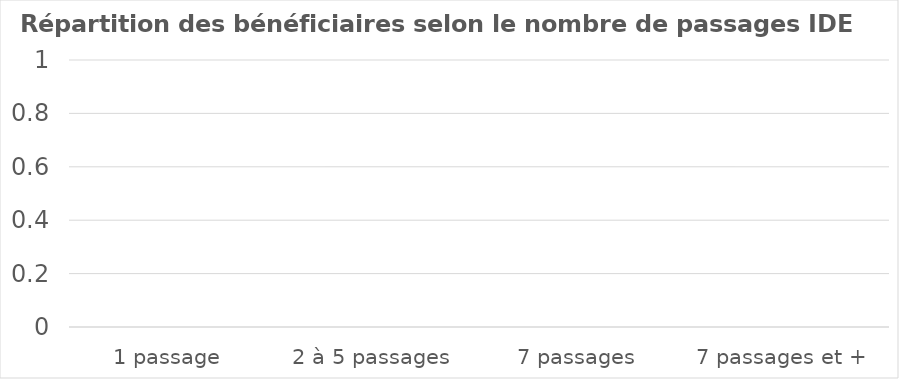
| Category | Series 0 |
|---|---|
| 1 passage | 0 |
| 2 à 5 passages | 0 |
| 7 passages | 0 |
| 7 passages et + | 0 |